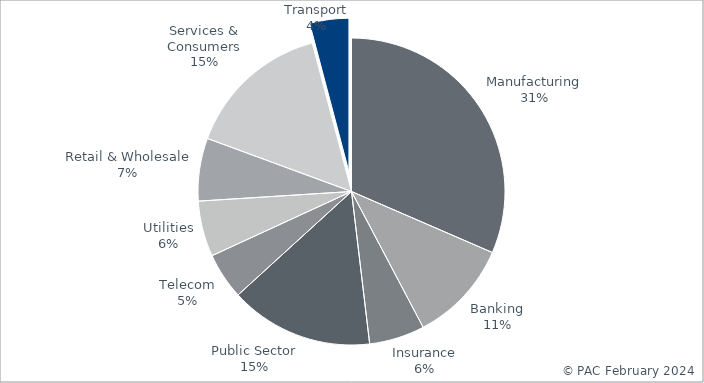
| Category | Series 0 |
|---|---|
| Manufacturing | 55209.221 |
| Banking | 18864.507 |
| Insurance | 10226.4 |
| Public Sector | 26500.331 |
| Telecom | 8590.435 |
| Utilities | 10275.869 |
| Retail & Wholesale | 11587.388 |
| Services & Consumers | 26753.164 |
| Transport | 7220.286 |